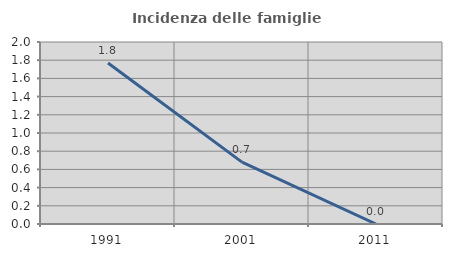
| Category | Incidenza delle famiglie numerose |
|---|---|
| 1991.0 | 1.77 |
| 2001.0 | 0.68 |
| 2011.0 | 0 |